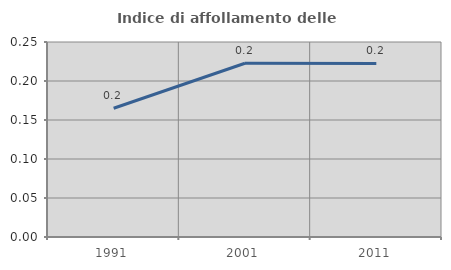
| Category | Indice di affollamento delle abitazioni  |
|---|---|
| 1991.0 | 0.165 |
| 2001.0 | 0.223 |
| 2011.0 | 0.223 |